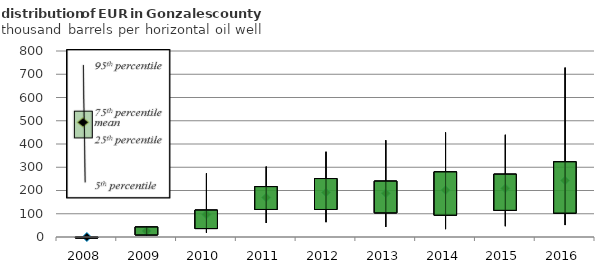
| Category | Mean |
|---|---|
| 2008.0 | 0 |
| 2009.0 | 26.021 |
| 2010.0 | 96.935 |
| 2011.0 | 169.946 |
| 2012.0 | 191.417 |
| 2013.0 | 187.997 |
| 2014.0 | 201.296 |
| 2015.0 | 208.874 |
| 2016.0 | 242.69 |